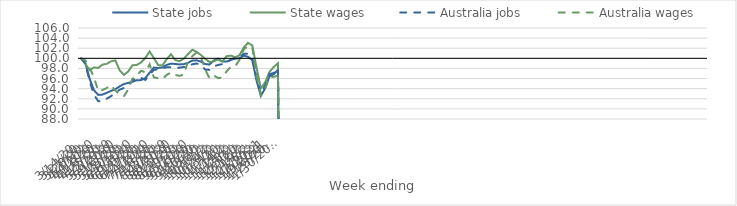
| Category | State jobs | State wages | Australia jobs | Australia wages |
|---|---|---|---|---|
| 14/03/2020 | 100 | 100 | 100 | 100 |
| 21/03/2020 | 99.026 | 98.876 | 98.956 | 99.595 |
| 28/03/2020 | 95.914 | 97.657 | 95.413 | 98.12 |
| 04/04/2020 | 93.691 | 98.197 | 92.814 | 96.244 |
| 11/04/2020 | 92.767 | 98.114 | 91.522 | 93.536 |
| 18/04/2020 | 92.83 | 98.762 | 91.5 | 93.735 |
| 25/04/2020 | 93.186 | 98.908 | 92.025 | 94.14 |
| 02/05/2020 | 93.568 | 99.419 | 92.519 | 94.693 |
| 09/05/2020 | 93.882 | 99.602 | 93.198 | 93.616 |
| 16/05/2020 | 94.459 | 97.626 | 93.788 | 92.845 |
| 23/05/2020 | 94.918 | 96.713 | 94.146 | 92.504 |
| 30/05/2020 | 95.134 | 97.402 | 94.65 | 93.808 |
| 06/06/2020 | 95.371 | 98.622 | 95.634 | 95.987 |
| 13/06/2020 | 95.675 | 98.691 | 96.135 | 96.641 |
| 20/06/2020 | 95.692 | 99.19 | 96.154 | 97.544 |
| 27/06/2020 | 96.096 | 100.069 | 95.728 | 97.236 |
| 04/07/2020 | 97.162 | 101.358 | 96.767 | 98.815 |
| 11/07/2020 | 98.173 | 100.046 | 97.729 | 96.243 |
| 18/07/2020 | 98.089 | 98.676 | 97.82 | 96.079 |
| 25/07/2020 | 98.2 | 98.579 | 98.028 | 95.887 |
| 01/08/2020 | 98.7 | 99.853 | 98.238 | 96.723 |
| 08/08/2020 | 98.948 | 100.817 | 98.223 | 97.204 |
| 15/08/2020 | 98.884 | 99.661 | 98.112 | 96.712 |
| 22/08/2020 | 98.797 | 99.441 | 98.158 | 96.554 |
| 29/08/2020 | 98.852 | 99.925 | 98.287 | 96.77 |
| 05/09/2020 | 99.123 | 100.859 | 98.443 | 99.477 |
| 12/09/2020 | 99.557 | 101.708 | 98.829 | 100.444 |
| 19/09/2020 | 99.603 | 101.27 | 98.97 | 101.162 |
| 26/09/2020 | 99.349 | 100.655 | 98.7 | 100.248 |
| 03/10/2020 | 98.864 | 99.885 | 97.765 | 97.757 |
| 10/10/2020 | 98.774 | 99.271 | 97.711 | 96.071 |
| 17/10/2020 | 99.563 | 99.413 | 98.435 | 96.645 |
| 24/10/2020 | 99.939 | 99.757 | 98.68 | 96.08 |
| 31/10/2020 | 99.401 | 99.381 | 98.863 | 96.206 |
| 07/11/2020 | 99.349 | 100.434 | 99.129 | 97.432 |
| 14/11/2020 | 99.688 | 100.535 | 99.776 | 98.33 |
| 21/11/2020 | 99.952 | 100.216 | 100.039 | 98.416 |
| 28/11/2020 | 100.007 | 100.608 | 100.264 | 99.694 |
| 05/12/2020 | 100.529 | 102.147 | 100.878 | 101.784 |
| 12/12/2020 | 100.308 | 103.069 | 100.916 | 102.402 |
| 19/12/2020 | 99.666 | 102.553 | 100.035 | 102.249 |
| 26/12/2020 | 95.593 | 98.156 | 96.089 | 96.528 |
| 02/01/2021 | 92.558 | 94.086 | 92.998 | 92.765 |
| 09/01/2021 | 94.09 | 95.224 | 94.651 | 94.062 |
| 16/01/2021 | 96.415 | 97.288 | 96.853 | 96.284 |
| 23/01/2021 | 96.842 | 98.292 | 97.109 | 96.336 |
| 30/01/2021 | 97.732 | 99.024 | 98.068 | 96.635 |